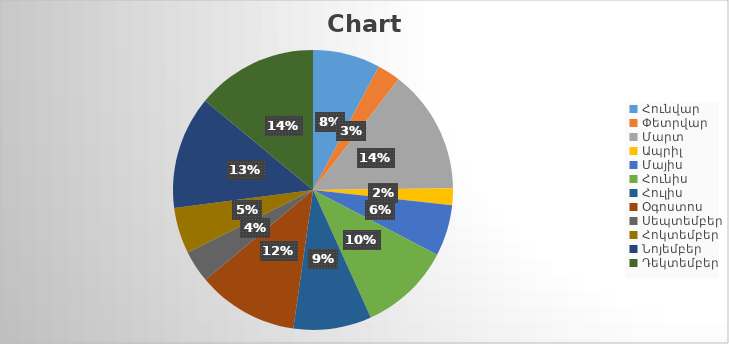
| Category | Series 0 |
|---|---|
| Հունվար | 50100 |
| Փետրվար | 17200 |
| Մարտ | 92100 |
| Ապրիլ | 12500 |
| Մայիս | 38000 |
| Հունիս | 68000 |
| Հուլիս | 58000 |
| Օգոստոս | 75000 |
| Սեպտեմբեր | 24000 |
| Հոկտեմբեր | 34000 |
| Նոյեմբեր | 84000 |
| Դեկտեմբեր | 90000 |